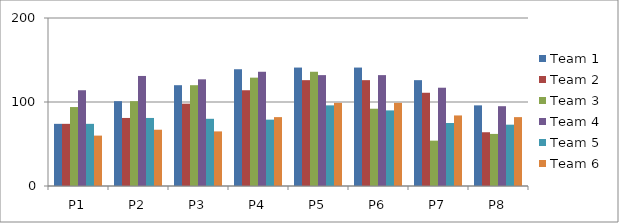
| Category | Team 1 | Team 2 | Team 3 | Team 4 | Team 5 | Team 6 |
|---|---|---|---|---|---|---|
| P1 | 74 | 74 | 94 | 114 | 74 | 60 |
| P2 | 101 | 81 | 101 | 131 | 81 | 67 |
| P3 | 120 | 98 | 120 | 127 | 80 | 65 |
| P4 | 139 | 114 | 129 | 136 | 79 | 82 |
| P5 | 141 | 126 | 136 | 132 | 96 | 99 |
| P6 | 141 | 126 | 92 | 132 | 90 | 99 |
| P7 | 126 | 111 | 54 | 117 | 75 | 84 |
| P8 | 96 | 64 | 62 | 95 | 73 | 82 |